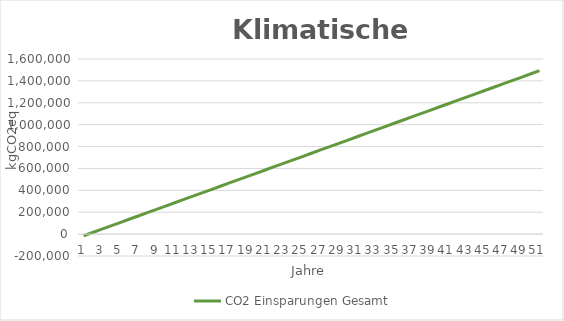
| Category | CO2 Einsparungen Gesamt |
|---|---|
| 0 | -15227.514 |
| 1 | 14937.36 |
| 2 | 45102.234 |
| 3 | 75267.108 |
| 4 | 105431.982 |
| 5 | 135596.856 |
| 6 | 165761.73 |
| 7 | 195926.604 |
| 8 | 226091.478 |
| 9 | 256256.352 |
| 10 | 286421.226 |
| 11 | 316586.1 |
| 12 | 346750.974 |
| 13 | 376915.848 |
| 14 | 407080.722 |
| 15 | 437245.596 |
| 16 | 467410.47 |
| 17 | 497575.344 |
| 18 | 527740.218 |
| 19 | 557905.092 |
| 20 | 588069.966 |
| 21 | 618234.84 |
| 22 | 648399.714 |
| 23 | 678564.588 |
| 24 | 708729.462 |
| 25 | 738894.336 |
| 26 | 769059.21 |
| 27 | 799224.084 |
| 28 | 829388.958 |
| 29 | 859553.832 |
| 30 | 889718.706 |
| 31 | 919883.58 |
| 32 | 950048.454 |
| 33 | 980213.328 |
| 34 | 1010378.202 |
| 35 | 1040543.076 |
| 36 | 1070707.95 |
| 37 | 1100872.824 |
| 38 | 1131037.698 |
| 39 | 1161202.572 |
| 40 | 1191367.446 |
| 41 | 1221532.32 |
| 42 | 1251697.194 |
| 43 | 1281862.068 |
| 44 | 1312026.942 |
| 45 | 1342191.816 |
| 46 | 1372356.69 |
| 47 | 1402521.564 |
| 48 | 1432686.438 |
| 49 | 1462851.312 |
| 50 | 1493016.186 |